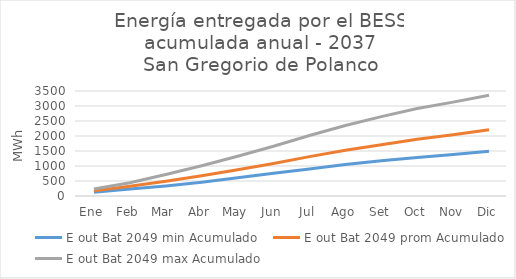
| Category | E out Bat 2049 min Acumulado | E out Bat 2049 prom Acumulado | E out Bat 2049 max Acumulado |
|---|---|---|---|
| Ene | 126 | 171.111 | 231 |
| Feb | 231 | 325.889 | 441 |
| Mar | 336 | 488.444 | 714 |
| Abr | 462 | 674.214 | 1008 |
| May | 609 | 874.88 | 1323 |
| Jun | 756 | 1085.658 | 1659 |
| Jul | 903 | 1312.658 | 2016 |
| Ago | 1050 | 1524.214 | 2352 |
| Set | 1176 | 1710.103 | 2646 |
| Oct | 1281 | 1888.214 | 2919 |
| Nov | 1386 | 2045.325 | 3129 |
| Dic | 1491 | 2208.658 | 3360 |